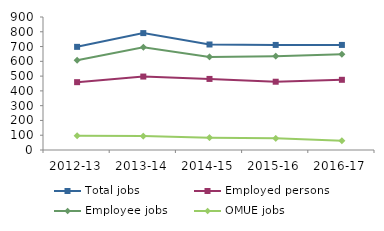
| Category | Total jobs | Employed persons | Employee jobs | OMUE jobs |
|---|---|---|---|---|
| 2012-13 | 698 | 459 | 607 | 97 |
| 2013-14 | 791 | 497 | 695 | 94 |
| 2014-15 | 714 | 481 | 630 | 83 |
| 2015-16 | 711 | 462 | 635 | 79 |
| 2016-17 | 711 | 475 | 648 | 63 |